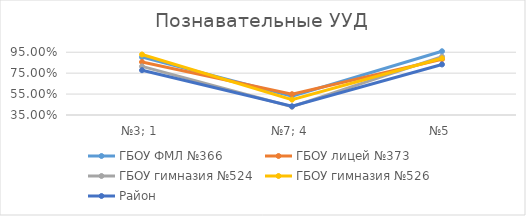
| Category | ГБОУ ФМЛ №366 | ГБОУ лицей №373 | ГБОУ гимназия №524 | ГБОУ гимназия №526 | Район |
|---|---|---|---|---|---|
| №3; 1 | 0.903 | 0.857 | 0.815 | 0.928 | 0.778 |
| №7; 4 | 0.531 | 0.549 | 0.429 | 0.497 | 0.433 |
| №5 | 0.959 | 0.884 | 0.908 | 0.892 | 0.833 |